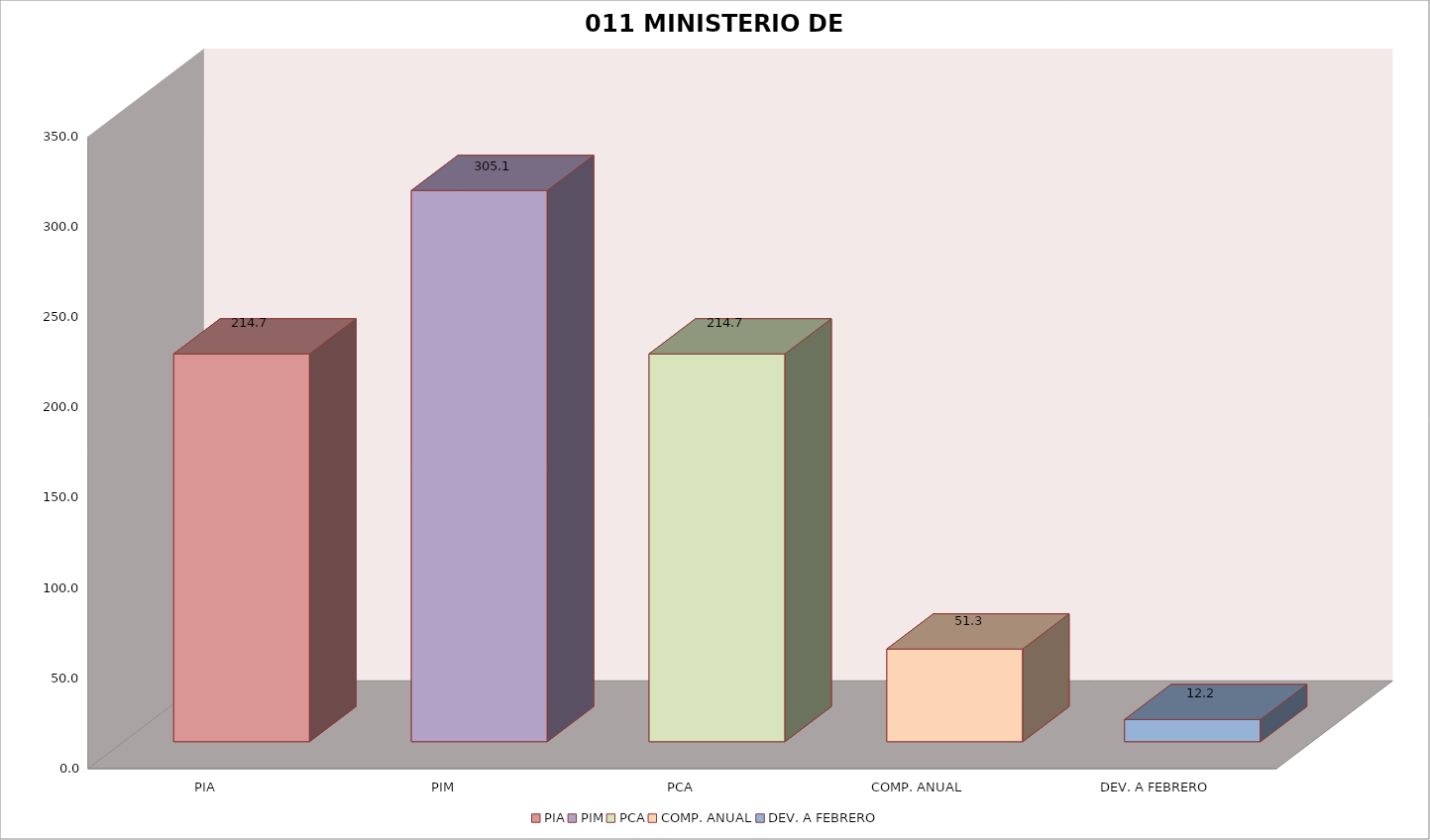
| Category | 011 MINISTERIO DE SALUD |
|---|---|
| PIA | 214.675 |
| PIM | 305.104 |
| PCA | 214.675 |
| COMP. ANUAL | 51.292 |
| DEV. A FEBRERO | 12.244 |